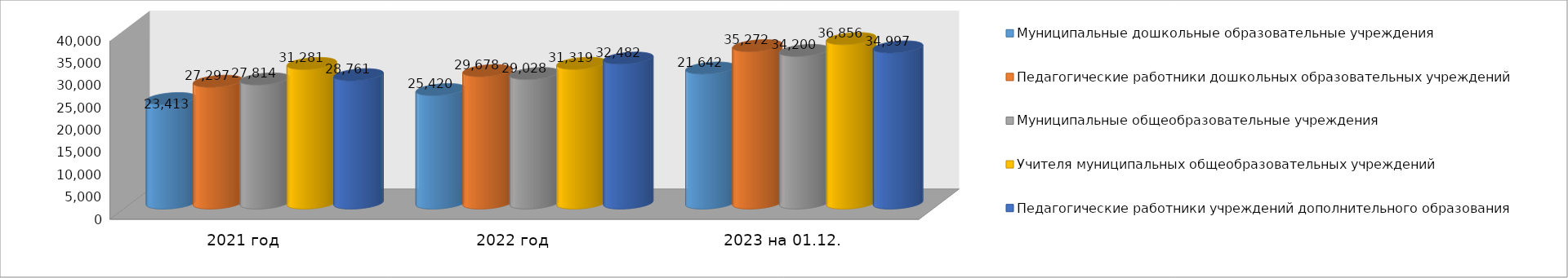
| Category | Муниципальные дошкольные образовательные учреждения | Педагогические работники дошкольных образовательных учреждений | Муниципальные общеобразовательные учреждения | Учителя муниципальных общеобразовательных учреждений | Педагогические работники учреждений дополнительного образования |
|---|---|---|---|---|---|
| 2021 год | 23413 | 27297 | 27814 | 31281 | 28761 |
| 2022 год | 25420 | 29678 | 29028 | 31319 | 32482 |
| 2023 на 01.12. | 30255 | 35272 | 34200 | 36856 | 34997 |